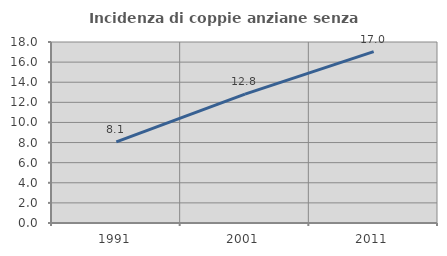
| Category | Incidenza di coppie anziane senza figli  |
|---|---|
| 1991.0 | 8.076 |
| 2001.0 | 12.815 |
| 2011.0 | 17.045 |